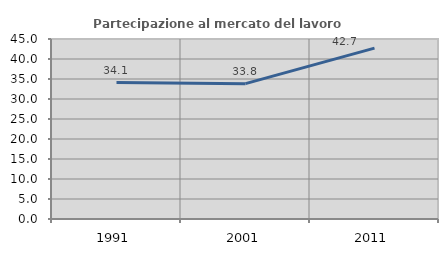
| Category | Partecipazione al mercato del lavoro  femminile |
|---|---|
| 1991.0 | 34.116 |
| 2001.0 | 33.837 |
| 2011.0 | 42.728 |